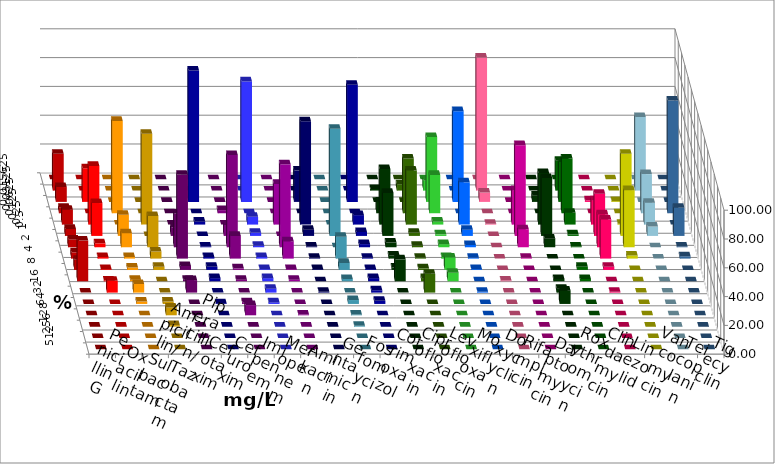
| Category | Penicillin G | Oxacillin | Ampicillin/ Sulbactam | Piperacillin/ Tazobactam | Cefotaxim | Cefuroxim | Imipenem | Meropenem | Amikacin | Gentamicin | Fosfomycin | Cotrimoxazol | Ciprofloxacin | Levofloxacin | Moxifloxacin | Doxycyclin | Rifampicin | Daptomycin | Roxythromycin | Clindamycin | Linezolid | Vancomycin | Teicoplanin | Tigecyclin |
|---|---|---|---|---|---|---|---|---|---|---|---|---|---|---|---|---|---|---|---|---|---|---|---|---|
| 0.015625 | 0 | 0 | 0 | 0 | 0 | 0 | 0 | 0 | 0 | 0 | 0 | 0 | 0 | 0 | 0 | 0 | 0 | 0 | 0 | 0 | 0 | 0 | 0 | 0 |
| 0.03125 | 25.543 | 0 | 0 | 0 | 0 | 0 | 0 | 0 | 0 | 0 | 0 | 0 | 1.087 | 4.348 | 7.065 | 0 | 92.391 | 0 | 0 | 20.652 | 0 | 0 | 0 | 51.087 |
| 0.0625 | 10.326 | 23.37 | 0 | 0 | 0 | 0 | 91.304 | 83.696 | 0 | 21.739 | 0 | 81.421 | 0 | 0 | 45.109 | 63.043 | 6.522 | 0 | 4.348 | 27.717 | 1.087 | 0.543 | 0 | 0 |
| 0.125 | 3.804 | 0 | 64.13 | 0 | 0 | 2.174 | 0 | 0 | 0 | 0 | 0 | 0 | 8.152 | 38.043 | 26.63 | 0 | 0 | 0 | 0 | 38.043 | 0 | 0 | 78.261 | 27.174 |
| 0.25 | 10.326 | 40.761 | 0 | 63.043 | 0 | 0 | 2.174 | 5.435 | 28.261 | 71.739 | 0 | 6.557 | 38.587 | 37.5 | 2.174 | 29.348 | 0.543 | 23.913 | 35.87 | 8.152 | 16.848 | 0.543 | 0 | 15.217 |
| 0.5 | 4.891 | 22.826 | 14.674 | 0 | 5.978 | 7.609 | 0 | 2.174 | 0 | 4.348 | 74.457 | 2.732 | 29.891 | 2.174 | 1.087 | 4.348 | 0 | 63.043 | 40.217 | 1.087 | 29.348 | 57.065 | 19.565 | 6.522 |
| 1.0 | 5.435 | 2.717 | 9.783 | 21.739 | 23.37 | 64.13 | 0.543 | 1.087 | 57.609 | 0.543 | 0 | 2.186 | 3.261 | 1.087 | 2.174 | 1.63 | 0 | 12.5 | 5.978 | 0.543 | 22.826 | 39.674 | 0.543 | 0 |
| 2.0 | 4.348 | 1.087 | 1.087 | 4.891 | 58.152 | 15.761 | 1.087 | 1.087 | 11.957 | 0.543 | 15.217 | 0.546 | 2.174 | 0.543 | 1.087 | 0.543 | 0 | 0.543 | 0 | 0 | 27.174 | 2.174 | 1.63 | 0 |
| 4.0 | 7.065 | 0.543 | 1.63 | 2.174 | 2.717 | 1.087 | 2.174 | 0.543 | 0.543 | 0.543 | 4.891 | 0.546 | 1.63 | 1.087 | 8.696 | 0.543 | 0 | 0 | 0 | 2.174 | 2.174 | 0 | 0 | 0 |
| 8.0 | 28.261 | 0.543 | 1.087 | 0 | 1.087 | 1.087 | 2.174 | 2.174 | 1.087 | 0 | 1.63 | 2.186 | 15.217 | 2.174 | 5.978 | 0 | 0.543 | 0 | 1.63 | 1.63 | 0 | 0 | 0 | 0 |
| 16.0 | 0 | 8.152 | 5.978 | 0 | 8.696 | 0 | 0 | 2.717 | 0 | 0.543 | 0 | 1.639 | 0 | 13.043 | 0 | 0.543 | 0 | 0 | 2.717 | 0 | 0.543 | 0 | 0 | 0 |
| 32.0 | 0 | 0 | 1.63 | 1.63 | 0 | 1.087 | 0.543 | 1.087 | 0 | 0 | 2.717 | 2.186 | 0 | 0 | 0 | 0 | 0 | 0 | 9.239 | 0 | 0 | 0 | 0 | 0 |
| 64.0 | 0 | 0 | 0 | 5.435 | 0 | 7.065 | 0 | 0 | 0.543 | 0 | 0.543 | 0 | 0 | 0 | 0 | 0 | 0 | 0 | 0 | 0 | 0 | 0 | 0 | 0 |
| 128.0 | 0 | 0 | 0 | 1.087 | 0 | 0 | 0 | 0 | 0 | 0 | 0.543 | 0 | 0 | 0 | 0 | 0 | 0 | 0 | 0 | 0 | 0 | 0 | 0 | 0 |
| 256.0 | 0 | 0 | 0 | 0 | 0 | 0 | 0 | 0 | 0 | 0 | 0 | 0 | 0 | 0 | 0 | 0 | 0 | 0 | 0 | 0 | 0 | 0 | 0 | 0 |
| 512.0 | 0 | 0 | 0 | 0 | 0 | 0 | 0 | 0 | 0 | 0 | 0 | 0 | 0 | 0 | 0 | 0 | 0 | 0 | 0 | 0 | 0 | 0 | 0 | 0 |